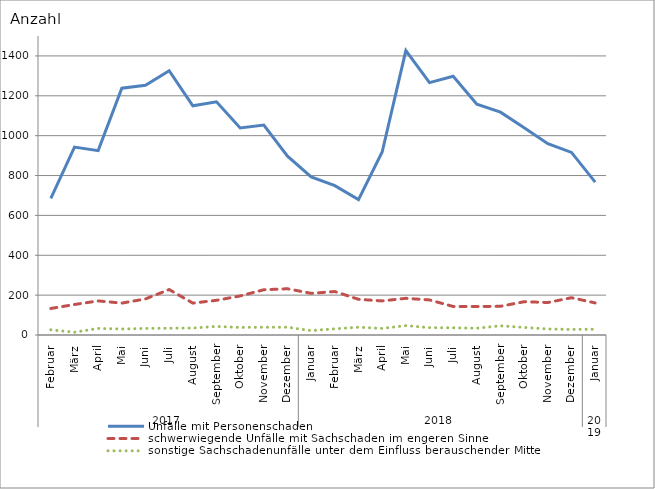
| Category | Unfälle mit Personenschaden | schwerwiegende Unfälle mit Sachschaden im engeren Sinne | sonstige Sachschadenunfälle unter dem Einfluss berauschender Mittel |
|---|---|---|---|
| 0 | 685 | 133 | 26 |
| 1 | 943 | 153 | 14 |
| 2 | 925 | 171 | 33 |
| 3 | 1238 | 160 | 30 |
| 4 | 1253 | 181 | 33 |
| 5 | 1326 | 228 | 34 |
| 6 | 1150 | 160 | 35 |
| 7 | 1170 | 174 | 43 |
| 8 | 1039 | 196 | 38 |
| 9 | 1053 | 227 | 39 |
| 10 | 897 | 232 | 39 |
| 11 | 793 | 209 | 22 |
| 12 | 749 | 218 | 31 |
| 13 | 679 | 179 | 39 |
| 14 | 918 | 171 | 33 |
| 15 | 1427 | 184 | 47 |
| 16 | 1266 | 176 | 37 |
| 17 | 1298 | 143 | 36 |
| 18 | 1158 | 143 | 34 |
| 19 | 1118 | 144 | 46 |
| 20 | 1040 | 167 | 38 |
| 21 | 960 | 163 | 30 |
| 22 | 916 | 187 | 28 |
| 23 | 767 | 161 | 29 |